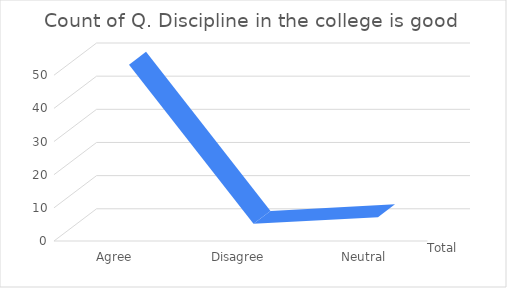
| Category | Total |
|---|---|
| Agree | 50 |
| Disagree | 2 |
| Neutral | 4 |